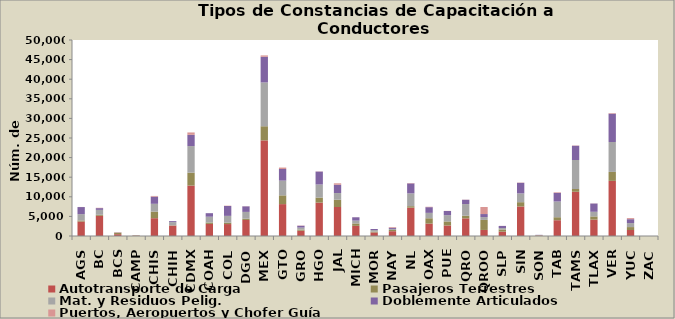
| Category | Autotransporte de Carga | Pasajeros Terrestres | Mat. y Residuos Pelig. | Doblemente Articulados | Puertos, Aeropuertos y Chofer Guía |
|---|---|---|---|---|---|
| AGS | 3694 | 271 | 1613 | 1807 | 22 |
| BC | 5153 | 256 | 1256 | 446 | 79 |
| BCS | 464 | 320 | 138 | 0 | 99 |
| CAMP | 94 | 58 | 29 | 0 | 5 |
| CHIS | 4544 | 1687 | 1982 | 1827 | 179 |
| CHIH | 2661 | 69 | 817 | 249 | 1 |
| CDMX | 12857 | 3307 | 6778 | 2868 | 607 |
| COAH | 3083 | 352 | 1481 | 905 | 0 |
| COL | 3048 | 350 | 1738 | 2516 | 78 |
| DGO | 4089 | 322 | 1738 | 1417 | 33 |
| MEX | 24392 | 3608 | 11170 | 6547 | 352 |
| GTO | 8135 | 2237 | 3756 | 2968 | 363 |
| GRO | 1362 | 279 | 505 | 466 | 60 |
| HGO | 8517 | 1293 | 3326 | 3301 | 46 |
| JAL | 7394 | 1851 | 1717 | 2112 | 366 |
| MICH | 2588 | 617 | 726 | 848 | 15 |
| MOR | 904 | 216 | 415 | 252 | 6 |
| NAY | 1223 | 327 | 254 | 301 | 167 |
| NL | 7235 | 378 | 3256 | 2553 | 89 |
| OAX | 3157 | 1372 | 1374 | 1453 | 96 |
| PUE | 2686 | 1030 | 1600 | 1067 | 30 |
| QRO | 4504 | 674 | 2968 | 1093 | 40 |
| QROO | 1544 | 2558 | 722 | 779 | 1802 |
| SLP | 1107 | 561 | 355 | 545 | 16 |
| SIN | 7531 | 1097 | 2236 | 2703 | 65 |
| SON | 135 | 18 | 96 | 44 | 7 |
| TAB | 4025 | 765 | 4009 | 2198 | 144 |
| TAMS | 11284 | 709 | 7394 | 3637 | 72 |
| TLAX | 4174 | 825 | 1179 | 2107 | 33 |
| VER | 14061 | 2287 | 7636 | 7221 | 143 |
| YUC | 1535 | 740 | 1020 | 996 | 271 |
| ZAC | 0 | 0 | 0 | 0 | 0 |